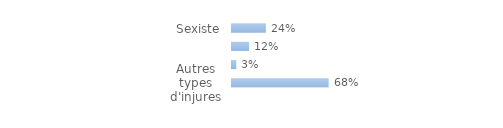
| Category | Series 0 |
|---|---|
| Autres types d'injures | 0.678 |
| Homophobe | 0.03 |
| Raciste, antisémite ou xénophobe | 0.12 |
| Sexiste | 0.238 |